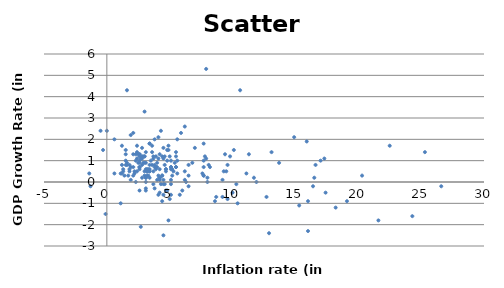
| Category | Series 0 |
|---|---|
| 4.2 | 0.2 |
| 4.1 | 2.1 |
| 5.8 | -0.6 |
| 5.5 | 0.7 |
| 6.5 | -0.2 |
| 4.6 | -0.1 |
| 3.2 | 0.5 |
| 3.8 | 2 |
| 2.3 | 0 |
| 4.1 | -0.6 |
| 4.5 | 0.1 |
| 3.6 | 1.7 |
| 4.5 | -2.5 |
| 1.9 | 2.2 |
| 1.9 | 0.1 |
| 2.1 | 1.3 |
| -0.3 | 1.5 |
| 0.6 | 2 |
| 0.0 | 2.4 |
| -0.5 | 2.4 |
| 1.1 | -1 |
| 1.5 | 1.5 |
| 1.8 | 0.6 |
| 2.4 | 1.7 |
| 3.0 | 0.5 |
| 4.2 | -0.5 |
| 4.3 | -0.1 |
| 4.7 | 0.6 |
| 5.6 | 1 |
| 3.9 | 0.7 |
| 2.6 | -0.4 |
| 3.1 | 0.2 |
| 1.6 | 4.3 |
| 1.3 | 0.5 |
| 2.1 | 2.3 |
| 1.5 | 1 |
| 2.8 | 1.6 |
| 4.4 | 0.3 |
| 4.5 | 1.6 |
| 4.5 | -0.1 |
| 5.2 | 0.3 |
| 4.8 | 1 |
| 4.6 | 0.8 |
| 4.4 | 0.3 |
| 3.8 | 0.7 |
| 3.7 | 0.5 |
| 3.8 | -0.3 |
| 3.6 | 1.4 |
| 2.5 | 1.3 |
| 1.7 | 0.3 |
| 2.1 | 0.3 |
| 3.0 | 3.3 |
| 4.5 | -0.6 |
| 5.6 | 2 |
| 5.6 | 0.4 |
| 6.2 | 0.1 |
| 5.4 | 0.9 |
| 5.1 | 0.7 |
| 5.2 | 0.6 |
| 5.0 | -0.8 |
| 5.9 | 2.3 |
| 6.8 | 0.9 |
| 7.7 | 0.7 |
| 8.6 | -0.9 |
| 9.8 | 1.2 |
| 10.1 | 1.5 |
| 9.2 | 0.1 |
| 8.0 | 0.2 |
| 6.2 | 2.6 |
| 6.5 | 0.3 |
| 7.7 | 1.8 |
| 7.9 | 5.3 |
| 9.3 | 0.5 |
| 9.2 | -0.7 |
| 10.3 | -0.1 |
| 12.9 | -2.4 |
| 15.9 | 1.9 |
| 17.0 | 1 |
| 18.2 | -1.2 |
| 20.3 | 0.3 |
| 24.3 | -1.6 |
| 26.6 | -0.2 |
| 25.3 | 1.4 |
| 22.5 | 1.7 |
| 16.0 | -0.9 |
| 13.7 | 0.9 |
| 14.9 | 2.1 |
| 16.5 | 0.2 |
| 17.4 | -0.5 |
| 16.6 | 0.8 |
| 13.1 | 1.4 |
| 9.5 | 0.5 |
| 7.7 | 1 |
| 7.9 | 1.1 |
| 8.1 | 0.8 |
| 9.6 | -0.8 |
| 10.6 | 4.3 |
| 16.0 | -2.3 |
| 17.3 | 1.1 |
| 19.1 | -0.9 |
| 21.6 | -1.8 |
| 16.4 | -0.2 |
| 15.3 | -1.1 |
| 12.7 | -0.7 |
| 11.7 | 0.2 |
| 11.3 | 1.3 |
| 11.9 | 0 |
| 11.1 | 0.4 |
| 9.4 | 1.3 |
| 8.0 | 0 |
| 6.2 | 0.5 |
| 4.9 | 1.5 |
| 3.8 | 0.8 |
| 4.6 | 1.2 |
| 5.0 | 1.2 |
| 5.1 | 1 |
| 5.1 | -0.6 |
| 4.7 | 0.5 |
| 4.8 | 1.5 |
| 5.5 | 1.2 |
| 7.0 | 1.6 |
| 6.3 | 0 |
| 5.5 | 0.7 |
| 4.9 | 1.7 |
| 2.8 | 1.2 |
| 2.6 | 0.6 |
| 3.4 | 1.8 |
| 3.9 | 0.7 |
| 4.2 | 1.3 |
| 4.3 | 2.4 |
| 4.1 | 1.1 |
| 3.4 | 1.8 |
| 4.2 | 0.6 |
| 5.5 | 1.4 |
| 6.5 | 0.8 |
| 7.7 | 0.3 |
| 8.2 | 0.7 |
| 7.7 | 0.3 |
| 7.6 | 0.4 |
| 7.8 | 1.2 |
| 9.6 | 0.8 |
| 10.4 | -1 |
| 10.0 | -0.5 |
| 8.7 | -0.7 |
| 6.0 | -0.4 |
| 4.8 | -0.4 |
| 4.2 | 0.2 |
| 4.1 | 0.3 |
| 4.2 | 0.1 |
| 3.6 | 0.8 |
| 3.1 | 0.9 |
| 1.8 | 0.8 |
| 1.3 | 0.6 |
| 1.6 | 0.9 |
| 1.6 | 0.8 |
| 2.4 | 1.4 |
| 2.6 | 1.3 |
| 2.3 | 1.3 |
| 2.6 | 0.7 |
| 3.4 | 0.5 |
| 3.4 | 0.5 |
| 3.7 | 1.2 |
| 3.2 | 0.5 |
| 2.8 | 1.1 |
| 2.2 | 0.4 |
| 2.1 | 0.7 |
| 2.6 | 0.9 |
| 2.7 | 1.1 |
| 2.6 | 1 |
| 3.5 | 1 |
| 3.7 | 1.1 |
| 3.4 | 0.8 |
| 4.0 | 0.7 |
| 3.3 | 0.6 |
| 3.0 | 0.9 |
| 2.2 | 0.5 |
| 1.4 | 0.3 |
| 1.2 | 1.7 |
| 1.5 | 1.3 |
| 2.3 | 1 |
| 3.1 | 1.4 |
| 3.2 | 0.3 |
| 3.1 | 0.2 |
| 2.6 | 1.3 |
| 1.9 | 0.7 |
| 1.8 | 0.5 |
| 1.1 | 0.4 |
| 1.2 | 0.4 |
| 1.2 | 0.8 |
| 1.5 | 0.8 |
| 2.5 | 0.9 |
| 3.1 | 0.6 |
| 3.0 | 1.2 |
| 2.9 | 1.2 |
| 2.6 | 1.2 |
| 2.6 | 0.7 |
| 2.8 | 0.2 |
| 3.1 | 0 |
| 3.4 | 0.6 |
| 3.2 | 0.6 |
| 3.0 | 1.2 |
| 2.8 | 0.8 |
| 2.4 | 1.1 |
| 2.4 | 0.5 |
| 3.0 | 0.3 |
| 3.4 | 0.2 |
| 4.0 | 0.9 |
| 4.5 | 1.1 |
| 4.4 | 1.2 |
| 3.9 | 1.2 |
| 4.2 | 0.2 |
| 4.0 | 0.1 |
| 4.4 | -0.9 |
| 4.9 | -1.8 |
| 2.7 | -2.1 |
| -0.1 | -1.5 |
| -1.3 | -0.2 |
| -1.4 | 0.4 |
| 0.6 | 0.4 |
| 3.9 | 0.6 |
| 5.1 | 0.7 |
| 4.7 | 0.6 |
| 4.7 | -0.4 |
| 5.3 | 0.5 |
| 5.1 | 0.1 |
| 5.1 | 0.6 |
| 5.1 | -0.1 |
| 3.7 | -0.1 |
| 3.1 | -0.4 |
| 2.9 | 0.9 |
| 3.1 | -0.3 |
| 3.3 | 0.3 |